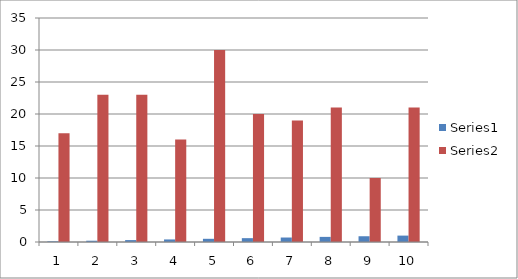
| Category | Series 0 | Series 1 |
|---|---|---|
| 0 | 0.1 | 17 |
| 1 | 0.2 | 23 |
| 2 | 0.3 | 23 |
| 3 | 0.4 | 16 |
| 4 | 0.5 | 30 |
| 5 | 0.6 | 20 |
| 6 | 0.7 | 19 |
| 7 | 0.8 | 21 |
| 8 | 0.9 | 10 |
| 9 | 1 | 21 |